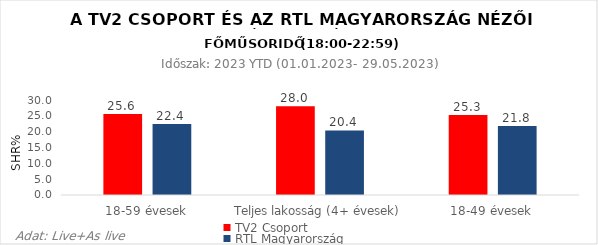
| Category | TV2 Csoport | RTL Magyarország |
|---|---|---|
| 18-59 évesek | 25.6 | 22.4 |
| Teljes lakosság (4+ évesek) | 28 | 20.4 |
| 18-49 évesek | 25.3 | 21.8 |